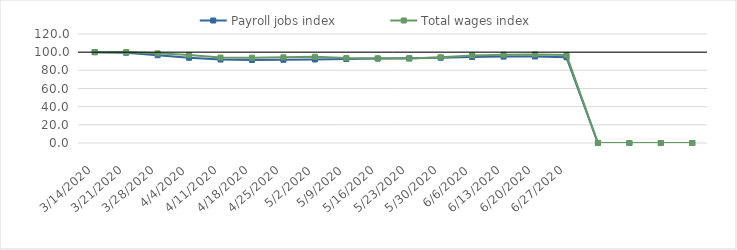
| Category | Payroll jobs index | Total wages index |
|---|---|---|
| 14/03/2020 | 100 | 100 |
| 21/03/2020 | 99.389 | 100.07 |
| 28/03/2020 | 96.608 | 98.707 |
| 04/04/2020 | 93.828 | 96.765 |
| 11/04/2020 | 91.887 | 94.047 |
| 18/04/2020 | 91.31 | 93.932 |
| 25/04/2020 | 91.6 | 94.326 |
| 02/05/2020 | 91.954 | 94.889 |
| 09/05/2020 | 92.449 | 93.491 |
| 16/05/2020 | 92.97 | 93.144 |
| 23/05/2020 | 93.251 | 92.924 |
| 30/05/2020 | 93.813 | 94.361 |
| 06/06/2020 | 94.668 | 96.401 |
| 13/06/2020 | 95.11 | 97.158 |
| 20/06/2020 | 95.246 | 97.537 |
| 27/06/2020 | 94.328 | 96.826 |